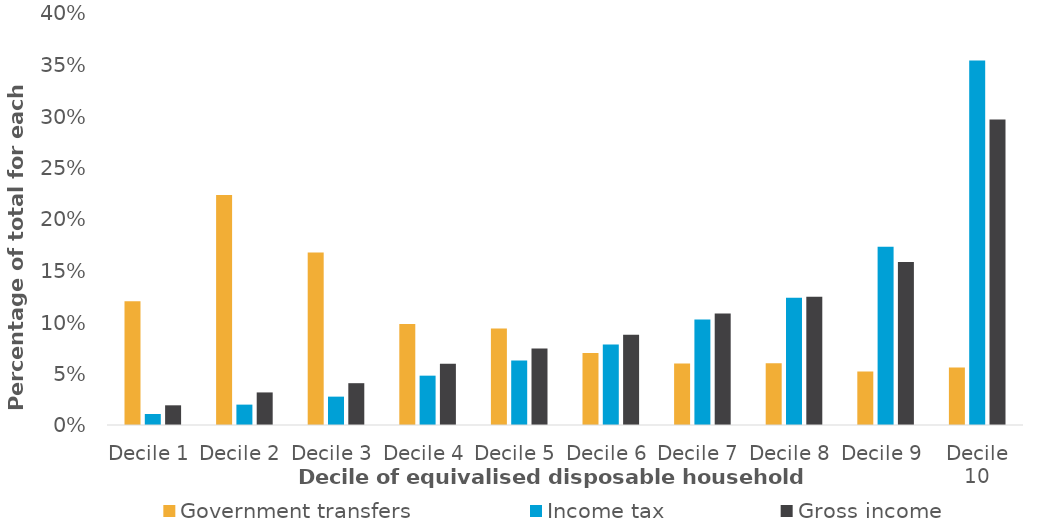
| Category | Government transfers | Income tax | Gross income  |
|---|---|---|---|
| Decile 1 | 0.12 | 0.011 | 0.019 |
| Decile 2 | 0.223 | 0.02 | 0.032 |
| Decile 3 | 0.167 | 0.028 | 0.041 |
| Decile 4 | 0.098 | 0.048 | 0.059 |
| Decile 5 | 0.094 | 0.063 | 0.074 |
| Decile 6 | 0.07 | 0.078 | 0.088 |
| Decile 7 | 0.06 | 0.102 | 0.108 |
| Decile 8 | 0.06 | 0.124 | 0.125 |
| Decile 9 | 0.052 | 0.173 | 0.158 |
| Decile 10 | 0.056 | 0.354 | 0.296 |